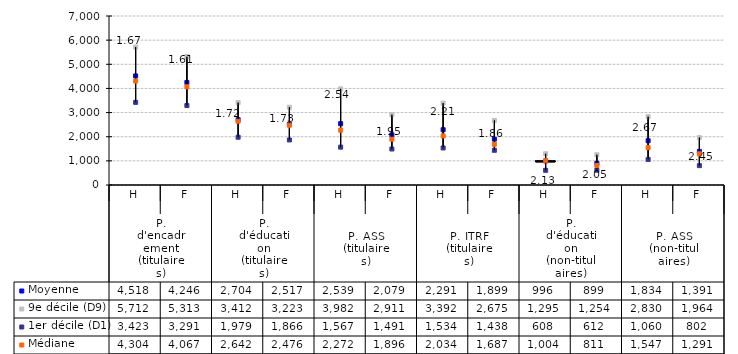
| Category | Moyenne | 9e décile (D9) | 1er décile (D1) | Médiane |
|---|---|---|---|---|
| 0 | 4518 | 5712 | 3423 | 4304 |
| 1 | 4246 | 5313 | 3291 | 4067 |
| 2 | 2704 | 3412 | 1979 | 2642 |
| 3 | 2517 | 3223 | 1866 | 2476 |
| 4 | 2539 | 3982 | 1567 | 2272 |
| 5 | 2079 | 2911 | 1491 | 1896 |
| 6 | 2291 | 3392 | 1534 | 2034 |
| 7 | 1899 | 2675 | 1438 | 1687 |
| 8 | 996 | 1295 | 608 | 1004 |
| 9 | 899 | 1254 | 612 | 811 |
| 10 | 1834 | 2830 | 1060 | 1547 |
| 11 | 1391 | 1964 | 802 | 1291 |